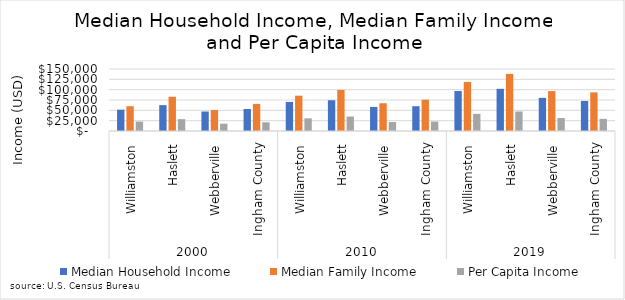
| Category | Median Household Income | Median Family Income | Per Capita Income |
|---|---|---|---|
| 0 | 51560 | 60002 | 22798 |
| 1 | 62539 | 82870 | 28686 |
| 2 | 47136 | 50850 | 17663 |
| 3 | 53170 | 65609 | 21079 |
| 4 | 70278 | 85383 | 30690 |
| 5 | 74441 | 99356 | 34914 |
| 6 | 58185 | 67150 | 21683 |
| 7 | 59947 | 75704 | 22883 |
| 8 | 96731 | 118710 | 41413 |
| 9 | 102027 | 138138 | 47228 |
| 10 | 80145 | 96538 | 31420 |
| 11 | 72682 | 93440 | 29380 |